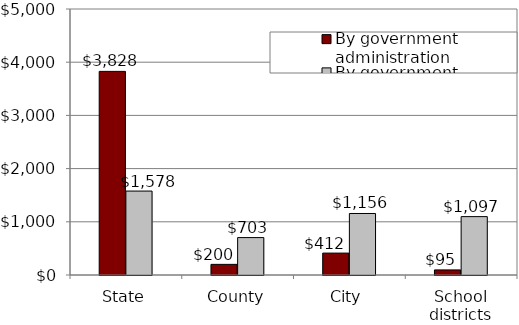
| Category | By government administration | By government responsibility |
|---|---|---|
| State | 3827526475.144 | 1577634836.557 |
| County | 199988885.688 | 703346752.219 |
| City | 411755477.094 | 1156249012.813 |
| School districts | 95344556.488 | 1097384792.826 |